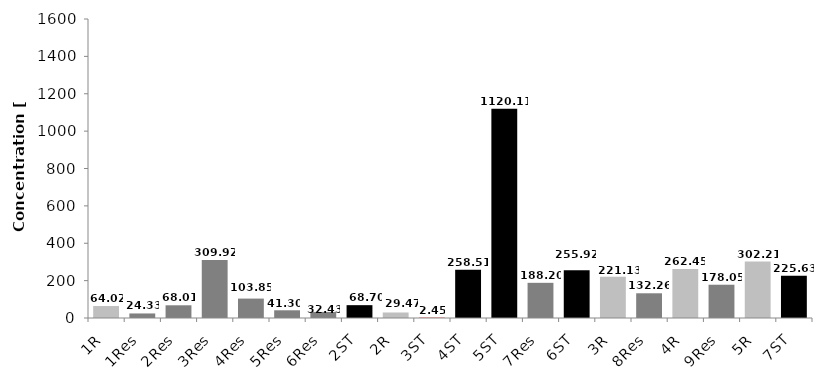
| Category | Concentrations of dioxins |
|---|---|
| 1R | 64.023 |
| 1Res | 24.333 |
| 2Res | 68.013 |
| 3Res | 309.924 |
| 4Res | 103.85 |
| 5Res | 41.3 |
| 6Res | 32.428 |
| 2ST | 68.702 |
| 2R | 29.467 |
| 3ST | 2.445 |
| 4ST | 258.51 |
| 5ST | 1120.106 |
| 7Res | 188.199 |
| 6ST | 255.918 |
| 3R | 221.127 |
| 8Res | 132.264 |
| 4R | 262.448 |
| 9Res | 178.052 |
| 5R | 302.214 |
| 7ST | 225.629 |